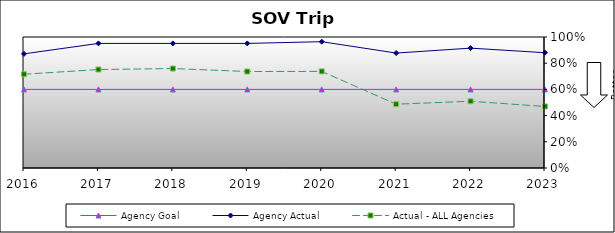
| Category | Agency Goal | Agency Actual | Actual - ALL Agencies |
|---|---|---|---|
| 2016.0 | 0.6 | 0.871 | 0.716 |
| 2017.0 | 0.6 | 0.951 | 0.752 |
| 2018.0 | 0.6 | 0.951 | 0.759 |
| 2019.0 | 0.6 | 0.951 | 0.736 |
| 2020.0 | 0.6 | 0.964 | 0.737 |
| 2021.0 | 0.6 | 0.877 | 0.487 |
| 2022.0 | 0.6 | 0.915 | 0.509 |
| 2023.0 | 0.6 | 0.88 | 0.47 |